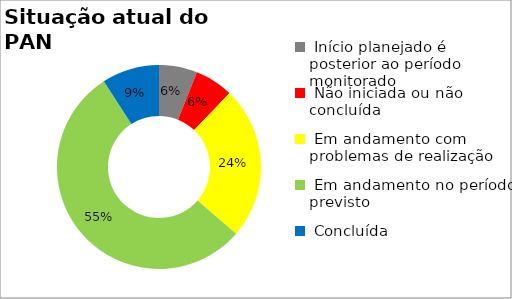
| Category | Series 0 |
|---|---|
|  Início planejado é posterior ao período monitorado | 0.061 |
|  Não iniciada ou não concluída | 0.061 |
|  Em andamento com problemas de realização | 0.242 |
|  Em andamento no período previsto  | 0.545 |
|  Concluída | 0.091 |